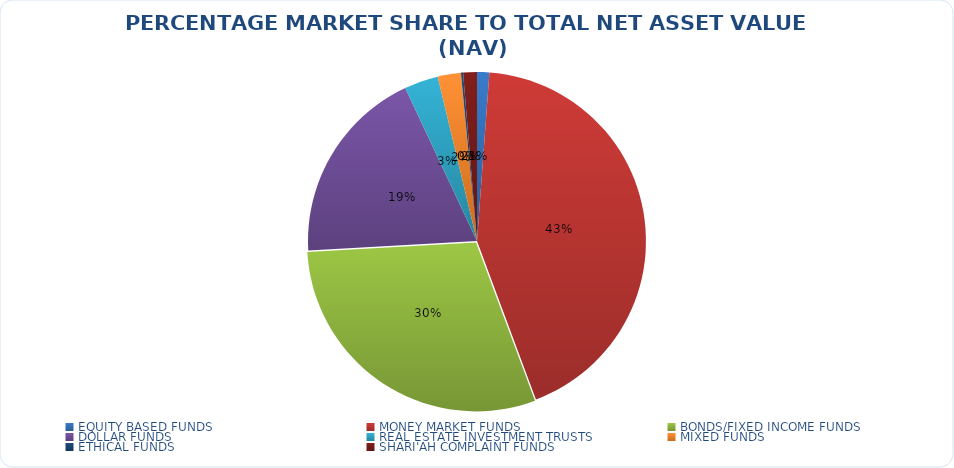
| Category | NET ASSET VALUE |
|---|---|
| EQUITY BASED FUNDS | 16487973033.78 |
| MONEY MARKET FUNDS | 606807349619.417 |
| BONDS/FIXED INCOME FUNDS | 418620801050.59 |
| DOLLAR FUNDS | 266057367731.924 |
| REAL ESTATE INVESTMENT TRUSTS | 45578708965.44 |
| MIXED FUNDS | 31174430452.156 |
| ETHICAL FUNDS | 2866495265.04 |
| SHARI'AH COMPLAINT FUNDS | 18471040677.19 |